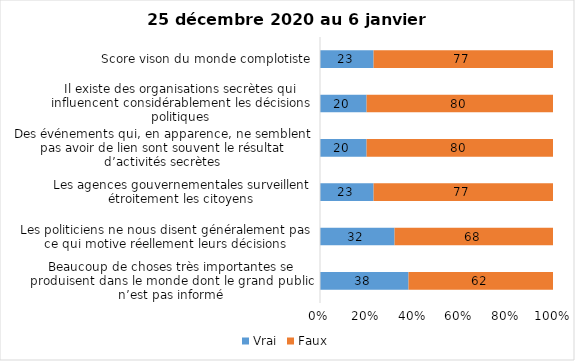
| Category | Vrai | Faux |
|---|---|---|
| Beaucoup de choses très importantes se produisent dans le monde dont le grand public n’est pas informé | 38 | 62 |
| Les politiciens ne nous disent généralement pas ce qui motive réellement leurs décisions | 32 | 68 |
| Les agences gouvernementales surveillent étroitement les citoyens | 23 | 77 |
| Des événements qui, en apparence, ne semblent pas avoir de lien sont souvent le résultat d’activités secrètes | 20 | 80 |
| Il existe des organisations secrètes qui influencent considérablement les décisions politiques | 20 | 80 |
| Score vison du monde complotiste | 23 | 77 |